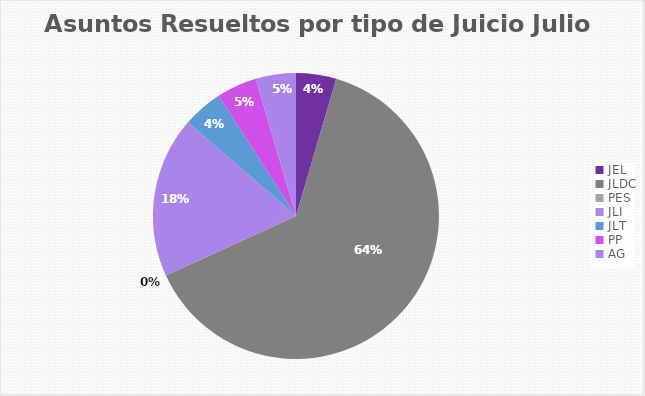
| Category | Asuntos Resueltos por tipo de Juicio  JULIO |
|---|---|
| JEL | 1 |
| JLDC | 14 |
| PES | 0 |
| JLI | 4 |
| JLT | 1 |
| PP | 1 |
| AG | 1 |